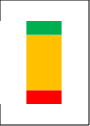
| Category | Series 0 | Series 1 | Series 2 |
|---|---|---|---|
| Summe11-16 | 0.1 | 0.4 | 0.1 |